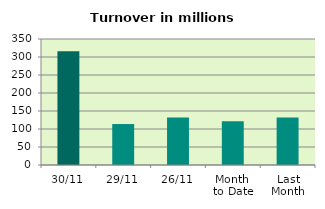
| Category | Series 0 |
|---|---|
| 30/11 | 315.643 |
| 29/11 | 113.768 |
| 26/11 | 132.033 |
| Month 
to Date | 121.455 |
| Last
Month | 132.268 |